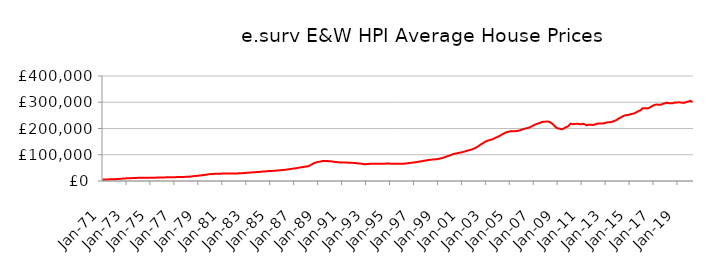
| Category | Series 0 |
|---|---|
| 1971-01-01 | 5721.637 |
| 1971-02-01 | 5762.296 |
| 1971-03-01 | 5803.295 |
| 1971-04-01 | 5856.6 |
| 1971-05-01 | 5945.059 |
| 1971-06-01 | 6037.239 |
| 1971-07-01 | 6150.593 |
| 1971-08-01 | 6273.935 |
| 1971-09-01 | 6396.293 |
| 1971-10-01 | 6523.41 |
| 1971-11-01 | 6660.635 |
| 1971-12-01 | 6827.73 |
| 1972-01-01 | 6943.709 |
| 1972-02-01 | 7019.642 |
| 1972-03-01 | 7192.485 |
| 1972-04-01 | 7434.182 |
| 1972-05-01 | 7783.4 |
| 1972-06-01 | 8089.841 |
| 1972-07-01 | 8442.17 |
| 1972-08-01 | 8782.047 |
| 1972-09-01 | 9082.157 |
| 1972-10-01 | 9362.629 |
| 1972-11-01 | 9622.344 |
| 1972-12-01 | 9890.271 |
| 1973-01-01 | 10081.941 |
| 1973-02-01 | 10217.371 |
| 1973-03-01 | 10373.062 |
| 1973-04-01 | 10550.653 |
| 1973-05-01 | 10778.346 |
| 1973-06-01 | 10926.279 |
| 1973-07-01 | 11081.212 |
| 1973-08-01 | 11253.08 |
| 1973-09-01 | 11453.654 |
| 1973-10-01 | 11661.609 |
| 1973-11-01 | 11820.086 |
| 1973-12-01 | 11933.729 |
| 1974-01-01 | 11994.68 |
| 1974-02-01 | 12060.371 |
| 1974-03-01 | 12057.68 |
| 1974-04-01 | 12031.652 |
| 1974-05-01 | 12008.684 |
| 1974-06-01 | 12009.52 |
| 1974-07-01 | 12021.199 |
| 1974-08-01 | 12060.402 |
| 1974-09-01 | 12131.717 |
| 1974-10-01 | 12219.316 |
| 1974-11-01 | 12291.911 |
| 1974-12-01 | 12363.582 |
| 1975-01-01 | 12396.74 |
| 1975-02-01 | 12438.568 |
| 1975-03-01 | 12512.8 |
| 1975-04-01 | 12618.502 |
| 1975-05-01 | 12746.827 |
| 1975-06-01 | 12815.529 |
| 1975-07-01 | 12882.897 |
| 1975-08-01 | 12975.913 |
| 1975-09-01 | 13101.794 |
| 1975-10-01 | 13241.651 |
| 1975-11-01 | 13364.792 |
| 1975-12-01 | 13496.487 |
| 1976-01-01 | 13589.21 |
| 1976-02-01 | 13676.529 |
| 1976-03-01 | 13736.277 |
| 1976-04-01 | 13799.828 |
| 1976-05-01 | 13882.974 |
| 1976-06-01 | 13937.373 |
| 1976-07-01 | 13997.548 |
| 1976-08-01 | 14086.604 |
| 1976-09-01 | 14214.053 |
| 1976-10-01 | 14357.689 |
| 1976-11-01 | 14472.621 |
| 1976-12-01 | 14575.256 |
| 1977-01-01 | 14632.325 |
| 1977-02-01 | 14697.865 |
| 1977-03-01 | 14740.363 |
| 1977-04-01 | 14790.21 |
| 1977-05-01 | 14867.201 |
| 1977-06-01 | 14937.016 |
| 1977-07-01 | 15022.857 |
| 1977-08-01 | 15140.588 |
| 1977-09-01 | 15284.567 |
| 1977-10-01 | 15446.76 |
| 1977-11-01 | 15618.347 |
| 1977-12-01 | 15842.314 |
| 1978-01-01 | 16008.634 |
| 1978-02-01 | 16138.444 |
| 1978-03-01 | 16313.376 |
| 1978-04-01 | 16548.702 |
| 1978-05-01 | 16925.958 |
| 1978-06-01 | 17307.721 |
| 1978-07-01 | 17769.442 |
| 1978-08-01 | 18243.045 |
| 1978-09-01 | 18698.842 |
| 1978-10-01 | 19152.07 |
| 1978-11-01 | 19574.7 |
| 1978-12-01 | 19992.283 |
| 1979-01-01 | 20240.686 |
| 1979-02-01 | 20407.294 |
| 1979-03-01 | 20822.308 |
| 1979-04-01 | 21391.186 |
| 1979-05-01 | 22117.161 |
| 1979-06-01 | 22577.858 |
| 1979-07-01 | 23056.032 |
| 1979-08-01 | 23594.497 |
| 1979-09-01 | 24239.606 |
| 1979-10-01 | 24928.227 |
| 1979-11-01 | 25501.578 |
| 1979-12-01 | 25947.078 |
| 1980-01-01 | 26191.666 |
| 1980-02-01 | 26381.777 |
| 1980-03-01 | 26625.705 |
| 1980-04-01 | 26911.328 |
| 1980-05-01 | 27245.442 |
| 1980-06-01 | 27424.169 |
| 1980-07-01 | 27586.236 |
| 1980-08-01 | 27736.009 |
| 1980-09-01 | 27841.614 |
| 1980-10-01 | 27909.24 |
| 1980-11-01 | 27961.216 |
| 1980-12-01 | 28071.794 |
| 1981-01-01 | 28137.528 |
| 1981-02-01 | 28237.242 |
| 1981-03-01 | 28337.226 |
| 1981-04-01 | 28471.422 |
| 1981-05-01 | 28607.481 |
| 1981-06-01 | 28653.642 |
| 1981-07-01 | 28675.655 |
| 1981-08-01 | 28681.095 |
| 1981-09-01 | 28627.074 |
| 1981-10-01 | 28528.492 |
| 1981-11-01 | 28437.987 |
| 1981-12-01 | 28428.134 |
| 1982-01-01 | 28384.207 |
| 1982-02-01 | 28403.446 |
| 1982-03-01 | 28560.962 |
| 1982-04-01 | 28826.348 |
| 1982-05-01 | 29123.624 |
| 1982-06-01 | 29232.109 |
| 1982-07-01 | 29313.958 |
| 1982-08-01 | 29470.039 |
| 1982-09-01 | 29723.125 |
| 1982-10-01 | 30023.812 |
| 1982-11-01 | 30323.377 |
| 1982-12-01 | 30694.881 |
| 1983-01-01 | 30977.174 |
| 1983-02-01 | 31219.783 |
| 1983-03-01 | 31472.577 |
| 1983-04-01 | 31785.86 |
| 1983-05-01 | 32196.746 |
| 1983-06-01 | 32519.187 |
| 1983-07-01 | 32870.27 |
| 1983-08-01 | 33203.815 |
| 1983-09-01 | 33470.441 |
| 1983-10-01 | 33688.574 |
| 1983-11-01 | 33894.414 |
| 1983-12-01 | 34164.762 |
| 1984-01-01 | 34326.341 |
| 1984-02-01 | 34490.39 |
| 1984-03-01 | 34801.858 |
| 1984-04-01 | 35233.922 |
| 1984-05-01 | 35728.512 |
| 1984-06-01 | 35947.792 |
| 1984-07-01 | 36131.309 |
| 1984-08-01 | 36410.916 |
| 1984-09-01 | 36857.095 |
| 1984-10-01 | 37373.309 |
| 1984-11-01 | 37772.28 |
| 1984-12-01 | 38049.568 |
| 1985-01-01 | 38126.541 |
| 1985-02-01 | 38232.92 |
| 1985-03-01 | 38494.448 |
| 1985-04-01 | 38861.795 |
| 1985-05-01 | 39281.243 |
| 1985-06-01 | 39443.336 |
| 1985-07-01 | 39593.189 |
| 1985-08-01 | 39852.962 |
| 1985-09-01 | 40286.193 |
| 1985-10-01 | 40780.974 |
| 1985-11-01 | 41196.83 |
| 1985-12-01 | 41529.429 |
| 1986-01-01 | 41658.708 |
| 1986-02-01 | 41790.707 |
| 1986-03-01 | 42176.28 |
| 1986-04-01 | 42734.024 |
| 1986-05-01 | 43430.153 |
| 1986-06-01 | 43851.604 |
| 1986-07-01 | 44282.443 |
| 1986-08-01 | 44796.764 |
| 1986-09-01 | 45443.204 |
| 1986-10-01 | 46141.317 |
| 1986-11-01 | 46774.998 |
| 1986-12-01 | 47365.819 |
| 1987-01-01 | 47708.6 |
| 1987-02-01 | 47992.425 |
| 1987-03-01 | 48608.074 |
| 1987-04-01 | 49436.983 |
| 1987-05-01 | 50427.396 |
| 1987-06-01 | 50986.248 |
| 1987-07-01 | 51520.875 |
| 1987-08-01 | 52109.244 |
| 1987-09-01 | 52747.907 |
| 1987-10-01 | 53409.041 |
| 1987-11-01 | 54028.462 |
| 1987-12-01 | 54670.064 |
| 1988-01-01 | 54975.068 |
| 1988-02-01 | 55238.121 |
| 1988-03-01 | 56158.153 |
| 1988-04-01 | 57542.733 |
| 1988-05-01 | 59626.022 |
| 1988-06-01 | 61728.232 |
| 1988-07-01 | 64203.536 |
| 1988-08-01 | 66480.514 |
| 1988-09-01 | 68233.782 |
| 1988-10-01 | 69689.501 |
| 1988-11-01 | 70860.28 |
| 1988-12-01 | 71899.755 |
| 1989-01-01 | 72443.122 |
| 1989-02-01 | 72902.486 |
| 1989-03-01 | 73682.173 |
| 1989-04-01 | 74674.86 |
| 1989-05-01 | 75726.533 |
| 1989-06-01 | 76186.029 |
| 1989-07-01 | 76498.876 |
| 1989-08-01 | 76645.547 |
| 1989-09-01 | 76519.1 |
| 1989-10-01 | 76165.266 |
| 1989-11-01 | 75694.544 |
| 1989-12-01 | 75310.879 |
| 1990-01-01 | 74965.571 |
| 1990-02-01 | 74951.401 |
| 1990-03-01 | 74436.887 |
| 1990-04-01 | 73769.099 |
| 1990-05-01 | 72988.276 |
| 1990-06-01 | 72615.68 |
| 1990-07-01 | 72298.179 |
| 1990-08-01 | 71988.705 |
| 1990-09-01 | 71553.822 |
| 1990-10-01 | 71056.748 |
| 1990-11-01 | 70595.419 |
| 1990-12-01 | 70399.45 |
| 1991-01-01 | 70261.691 |
| 1991-02-01 | 70335.512 |
| 1991-03-01 | 70223.689 |
| 1991-04-01 | 70149.821 |
| 1991-05-01 | 70052.594 |
| 1991-06-01 | 70009.084 |
| 1991-07-01 | 69962.851 |
| 1991-08-01 | 69897.993 |
| 1991-09-01 | 69786.979 |
| 1991-10-01 | 69588.396 |
| 1991-11-01 | 69263.131 |
| 1991-12-01 | 68919.119 |
| 1992-01-01 | 68578.405 |
| 1992-02-01 | 68526.157 |
| 1992-03-01 | 68048.234 |
| 1992-04-01 | 67471.368 |
| 1992-05-01 | 66834.583 |
| 1992-06-01 | 66626.137 |
| 1992-07-01 | 66476.266 |
| 1992-08-01 | 66161.735 |
| 1992-09-01 | 65490.411 |
| 1992-10-01 | 64657.436 |
| 1992-11-01 | 64092.776 |
| 1992-12-01 | 64109.213 |
| 1993-01-01 | 64267.822 |
| 1993-02-01 | 64548.5 |
| 1993-03-01 | 64800.703 |
| 1993-04-01 | 65116.213 |
| 1993-05-01 | 65385.205 |
| 1993-06-01 | 65415.975 |
| 1993-07-01 | 65435.438 |
| 1993-08-01 | 65489.316 |
| 1993-09-01 | 65448.33 |
| 1993-10-01 | 65330.402 |
| 1993-11-01 | 65253.231 |
| 1993-12-01 | 65481.666 |
| 1994-01-01 | 65795.911 |
| 1994-02-01 | 66187.658 |
| 1994-03-01 | 66172.726 |
| 1994-04-01 | 66012.999 |
| 1994-05-01 | 65872.726 |
| 1994-06-01 | 65885.299 |
| 1994-07-01 | 65964.465 |
| 1994-08-01 | 66127.292 |
| 1994-09-01 | 66386.103 |
| 1994-10-01 | 66699.652 |
| 1994-11-01 | 66848.045 |
| 1994-12-01 | 66760.501 |
| 1995-01-01 | 66271.317 |
| 1995-02-01 | 65850.218 |
| 1995-03-01 | 65691.881 |
| 1995-04-01 | 65526.898 |
| 1995-05-01 | 65554.846 |
| 1995-06-01 | 65415.772 |
| 1995-07-01 | 65558.368 |
| 1995-08-01 | 65621.703 |
| 1995-09-01 | 65659.154 |
| 1995-10-01 | 65635.619 |
| 1995-11-01 | 65718.381 |
| 1995-12-01 | 65799.005 |
| 1996-01-01 | 65822.874 |
| 1996-02-01 | 65782.824 |
| 1996-03-01 | 66000.184 |
| 1996-04-01 | 66256.695 |
| 1996-05-01 | 66744.04 |
| 1996-06-01 | 67100.794 |
| 1996-07-01 | 67683.378 |
| 1996-08-01 | 68247.062 |
| 1996-09-01 | 68816.57 |
| 1996-10-01 | 69231.247 |
| 1996-11-01 | 69670.904 |
| 1996-12-01 | 70292.598 |
| 1997-01-01 | 70738.527 |
| 1997-02-01 | 71213.588 |
| 1997-03-01 | 71619.33 |
| 1997-04-01 | 72277.827 |
| 1997-05-01 | 73137.953 |
| 1997-06-01 | 73791.083 |
| 1997-07-01 | 74252.184 |
| 1997-08-01 | 74987.177 |
| 1997-09-01 | 75644.772 |
| 1997-10-01 | 76496.497 |
| 1997-11-01 | 77092.068 |
| 1997-12-01 | 77848.446 |
| 1998-01-01 | 78297.188 |
| 1998-02-01 | 78971.066 |
| 1998-03-01 | 79558.894 |
| 1998-04-01 | 80288.676 |
| 1998-05-01 | 80807.089 |
| 1998-06-01 | 81125.572 |
| 1998-07-01 | 81506.943 |
| 1998-08-01 | 81863.791 |
| 1998-09-01 | 82224.992 |
| 1998-10-01 | 82464.657 |
| 1998-11-01 | 82744.276 |
| 1998-12-01 | 83080.436 |
| 1999-01-01 | 83577.993 |
| 1999-02-01 | 84571.705 |
| 1999-03-01 | 85447.682 |
| 1999-04-01 | 86316.681 |
| 1999-05-01 | 87268.309 |
| 1999-06-01 | 88275.026 |
| 1999-07-01 | 89460.227 |
| 1999-08-01 | 90994.233 |
| 1999-09-01 | 92557.97 |
| 1999-10-01 | 93994.71 |
| 1999-11-01 | 94970.284 |
| 1999-12-01 | 96280.655 |
| 2000-01-01 | 97325.701 |
| 2000-02-01 | 99209.663 |
| 2000-03-01 | 100688.495 |
| 2000-04-01 | 102265.077 |
| 2000-05-01 | 103063.262 |
| 2000-06-01 | 104041.767 |
| 2000-07-01 | 104914.739 |
| 2000-08-01 | 105728.177 |
| 2000-09-01 | 106483.482 |
| 2000-10-01 | 107259.346 |
| 2000-11-01 | 107898.373 |
| 2000-12-01 | 108711.995 |
| 2001-01-01 | 109371.114 |
| 2001-02-01 | 110393.728 |
| 2001-03-01 | 111350.355 |
| 2001-04-01 | 112525.531 |
| 2001-05-01 | 113793.316 |
| 2001-06-01 | 114844.266 |
| 2001-07-01 | 115990.605 |
| 2001-08-01 | 117133.207 |
| 2001-09-01 | 118167.979 |
| 2001-10-01 | 118862.601 |
| 2001-11-01 | 120047.789 |
| 2001-12-01 | 121360.722 |
| 2002-01-01 | 123114.809 |
| 2002-02-01 | 124819.005 |
| 2002-03-01 | 126855.333 |
| 2002-04-01 | 129047.909 |
| 2002-05-01 | 131523.479 |
| 2002-06-01 | 134030.721 |
| 2002-07-01 | 136776.102 |
| 2002-08-01 | 139215.035 |
| 2002-09-01 | 141803.563 |
| 2002-10-01 | 144227.825 |
| 2002-11-01 | 146357.451 |
| 2002-12-01 | 148702.365 |
| 2003-01-01 | 150794.009 |
| 2003-02-01 | 152510.864 |
| 2003-03-01 | 153898.607 |
| 2003-04-01 | 155226.269 |
| 2003-05-01 | 156353.205 |
| 2003-06-01 | 157259.237 |
| 2003-07-01 | 158057.815 |
| 2003-08-01 | 159627.899 |
| 2003-09-01 | 161267.535 |
| 2003-10-01 | 163410.624 |
| 2003-11-01 | 165491.163 |
| 2003-12-01 | 167233.597 |
| 2004-01-01 | 167957.067 |
| 2004-02-01 | 170238.124 |
| 2004-03-01 | 172480.568 |
| 2004-04-01 | 174513.653 |
| 2004-05-01 | 176743.804 |
| 2004-06-01 | 178895.701 |
| 2004-07-01 | 180975.64 |
| 2004-08-01 | 183049.298 |
| 2004-09-01 | 184672.192 |
| 2004-10-01 | 186320.382 |
| 2004-11-01 | 187184.644 |
| 2004-12-01 | 188206.909 |
| 2005-01-01 | 189021.112 |
| 2005-02-01 | 190183.952 |
| 2005-03-01 | 190005.817 |
| 2005-04-01 | 190071.875 |
| 2005-05-01 | 189485.539 |
| 2005-06-01 | 190073.366 |
| 2005-07-01 | 190099.846 |
| 2005-08-01 | 190409.416 |
| 2005-09-01 | 191025.705 |
| 2005-10-01 | 192128.229 |
| 2005-11-01 | 193022.749 |
| 2005-12-01 | 194589.472 |
| 2006-01-01 | 195561.889 |
| 2006-02-01 | 197180.233 |
| 2006-03-01 | 198290.018 |
| 2006-04-01 | 199521.21 |
| 2006-05-01 | 200291.878 |
| 2006-06-01 | 200874.24 |
| 2006-07-01 | 201753.772 |
| 2006-08-01 | 202945.476 |
| 2006-09-01 | 204665.909 |
| 2006-10-01 | 206669.853 |
| 2006-11-01 | 208271.992 |
| 2006-12-01 | 210431.706 |
| 2007-01-01 | 212236.573 |
| 2007-02-01 | 214691.924 |
| 2007-03-01 | 215960.598 |
| 2007-04-01 | 217668.208 |
| 2007-05-01 | 218745.526 |
| 2007-06-01 | 220436.757 |
| 2007-07-01 | 221128.98 |
| 2007-08-01 | 222903.284 |
| 2007-09-01 | 224639.27 |
| 2007-10-01 | 225909.983 |
| 2007-11-01 | 225637.65 |
| 2007-12-01 | 225795.991 |
| 2008-01-01 | 226230.744 |
| 2008-02-01 | 227150.677 |
| 2008-03-01 | 226536.237 |
| 2008-04-01 | 226088.749 |
| 2008-05-01 | 224583.894 |
| 2008-06-01 | 222870.934 |
| 2008-07-01 | 219624.904 |
| 2008-08-01 | 216697.269 |
| 2008-09-01 | 213087.292 |
| 2008-10-01 | 209193.305 |
| 2008-11-01 | 204692.274 |
| 2008-12-01 | 201599.231 |
| 2009-01-01 | 200403.32 |
| 2009-02-01 | 201116.809 |
| 2009-03-01 | 199383.582 |
| 2009-04-01 | 198315.606 |
| 2009-05-01 | 196756.715 |
| 2009-06-01 | 198255.489 |
| 2009-07-01 | 199781.16 |
| 2009-08-01 | 202057.625 |
| 2009-09-01 | 204651.712 |
| 2009-10-01 | 206995.738 |
| 2009-11-01 | 207417.779 |
| 2009-12-01 | 211553.202 |
| 2010-01-01 | 214802.067 |
| 2010-02-01 | 218402.314 |
| 2010-03-01 | 216979.67 |
| 2010-04-01 | 216236.552 |
| 2010-05-01 | 216342.245 |
| 2010-06-01 | 217108.95 |
| 2010-07-01 | 217722.397 |
| 2010-08-01 | 218424.805 |
| 2010-09-01 | 218322.566 |
| 2010-10-01 | 217469.066 |
| 2010-11-01 | 215945.135 |
| 2010-12-01 | 216018.582 |
| 2011-01-01 | 216546.568 |
| 2011-02-01 | 218068.153 |
| 2011-03-01 | 218196.649 |
| 2011-04-01 | 216131.402 |
| 2011-05-01 | 213449.47 |
| 2011-06-01 | 211977.123 |
| 2011-07-01 | 212947.067 |
| 2011-08-01 | 214410.19 |
| 2011-09-01 | 214360.747 |
| 2011-10-01 | 214614.218 |
| 2011-11-01 | 213368.423 |
| 2011-12-01 | 213453.491 |
| 2012-01-01 | 214164.256 |
| 2012-02-01 | 214959.421 |
| 2012-03-01 | 216756.933 |
| 2012-04-01 | 217525.251 |
| 2012-05-01 | 219534.588 |
| 2012-06-01 | 219513.993 |
| 2012-07-01 | 219293.182 |
| 2012-08-01 | 218806.749 |
| 2012-09-01 | 219040.471 |
| 2012-10-01 | 219439.904 |
| 2012-11-01 | 219547.943 |
| 2012-12-01 | 220234.493 |
| 2013-01-01 | 220907.865 |
| 2013-02-01 | 222701.635 |
| 2013-03-01 | 223469.687 |
| 2013-04-01 | 224076.303 |
| 2013-05-01 | 223921.625 |
| 2013-06-01 | 224267.124 |
| 2013-07-01 | 225135.999 |
| 2013-08-01 | 226546.907 |
| 2013-09-01 | 227936.906 |
| 2013-10-01 | 229322.843 |
| 2013-11-01 | 230315.56 |
| 2013-12-01 | 232460.97 |
| 2014-01-01 | 235647.935 |
| 2014-02-01 | 237927.871 |
| 2014-03-01 | 240195.48 |
| 2014-04-01 | 241469.41 |
| 2014-05-01 | 243828.789 |
| 2014-06-01 | 245878.968 |
| 2014-07-01 | 247539.081 |
| 2014-08-01 | 249418.581 |
| 2014-09-01 | 250747.668 |
| 2014-10-01 | 251554.885 |
| 2014-11-01 | 251534.53 |
| 2014-12-01 | 251925.861 |
| 2015-01-01 | 253431.809 |
| 2015-02-01 | 254648.094 |
| 2015-03-01 | 255340.043 |
| 2015-04-01 | 255876.646 |
| 2015-05-01 | 257025.996 |
| 2015-06-01 | 258406.622 |
| 2015-07-01 | 259602.635 |
| 2015-08-01 | 262060.066 |
| 2015-09-01 | 264071.331 |
| 2015-10-01 | 266782.334 |
| 2015-11-01 | 267291.861 |
| 2015-12-01 | 269274.759 |
| 2016-01-01 | 271443.4 |
| 2016-02-01 | 277004.369 |
| 2016-03-01 | 277389.465 |
| 2016-04-01 | 277297.091 |
| 2016-05-01 | 275418.62 |
| 2016-06-01 | 276421.502 |
| 2016-07-01 | 276889.319 |
| 2016-08-01 | 277720.279 |
| 2016-09-01 | 279478.836 |
| 2016-10-01 | 282129.038 |
| 2016-11-01 | 283867.789 |
| 2016-12-01 | 285994.373 |
| 2017-01-01 | 288305.174 |
| 2017-02-01 | 290047.786 |
| 2017-03-01 | 291500.755 |
| 2017-04-01 | 291264.163 |
| 2017-05-01 | 291153.386 |
| 2017-06-01 | 290026.535 |
| 2017-07-01 | 289885.181 |
| 2017-08-01 | 290351.528 |
| 2017-09-01 | 292184.806 |
| 2017-10-01 | 293542.539 |
| 2017-11-01 | 294658.844 |
| 2017-12-01 | 295560.962 |
| 2018-01-01 | 297174.388 |
| 2018-02-01 | 298313.44 |
| 2018-03-01 | 297460.703 |
| 2018-04-01 | 296660.349 |
| 2018-05-01 | 295704.696 |
| 2018-06-01 | 296136.927 |
| 2018-07-01 | 295042.264 |
| 2018-08-01 | 295883.669 |
| 2018-09-01 | 296762.15 |
| 2018-10-01 | 298734.437 |
| 2018-11-01 | 297922.604 |
| 2018-12-01 | 298469.45 |
| 2019-01-01 | 299042.364 |
| 2019-02-01 | 300360.183 |
| 2019-03-01 | 299500.693 |
| 2019-04-01 | 298742.186 |
| 2019-05-01 | 298596.099 |
| 2019-06-01 | 298401.121 |
| 2019-07-01 | 297679.436 |
| 2019-08-01 | 297595.33 |
| 2019-09-01 | 299289.015 |
| 2019-10-01 | 301265.194 |
| 2019-11-01 | 302319.229 |
| 2019-12-01 | 302787.934 |
| 2020-01-01 | 303569.898 |
| 2020-02-01 | 305323.106 |
| 2020-03-01 | 304513.558 |
| 2020-04-01 | 300883.718 |